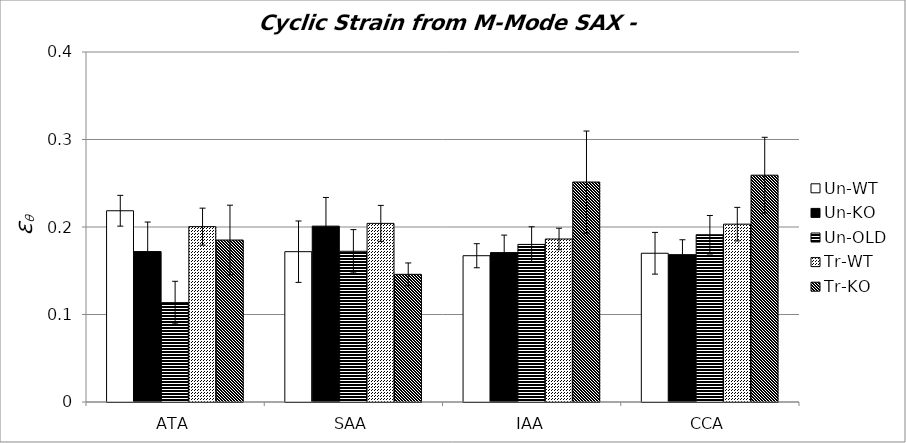
| Category | Un-WT | Un-KO | Un-OLD | Tr-WT | Tr-KO |
|---|---|---|---|---|---|
| 0 | 0.219 | 0.172 | 0.114 | 0.2 | 0.185 |
| 1 | 0.172 | 0.201 | 0.172 | 0.204 | 0.146 |
| 2 | 0.167 | 0.171 | 0.18 | 0.186 | 0.251 |
| 3 | 0.17 | 0.168 | 0.191 | 0.203 | 0.259 |